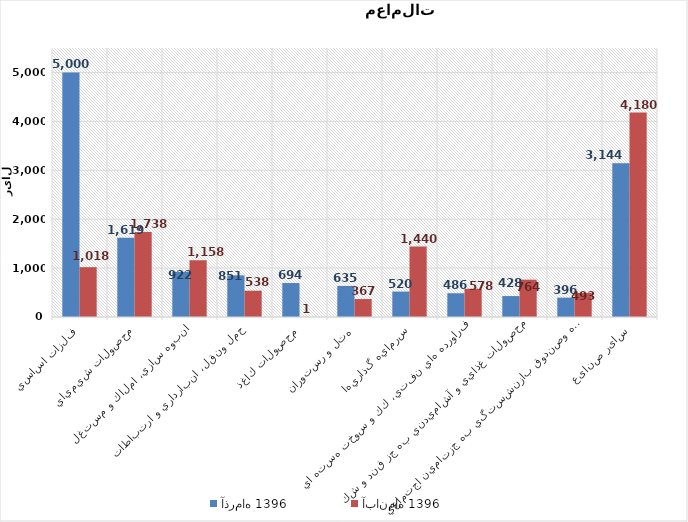
| Category | آذر‌ماه 1396 | آبان‌ماه 1396 |
|---|---|---|
| فلزات اساسي | 5000.298 | 1018.464 |
| محصولات شيميايي | 1619.008 | 1737.508 |
| انبوه سازي، املاك و مستغلات | 922.21 | 1157.909 |
| حمل ونقل، انبارداري و ارتباطات | 851.149 | 538.041 |
| محصولات كاغذي | 694.308 | 0.849 |
| هتل و رستوران | 635.433 | 367.085 |
| سرمايه گذاريها | 519.935 | 1439.58 |
| فراورده هاي نفتي، كك و سوخت هسته اي | 485.591 | 577.88 |
| محصولات غذايي و آشاميدني به جز قند و شكر | 428.238 | 763.634 |
| بيمه وصندوق بازنشستگي به جزتامين اجتماعي | 396.024 | 492.603 |
| سایر صنایع | 3144.014 | 4179.852 |